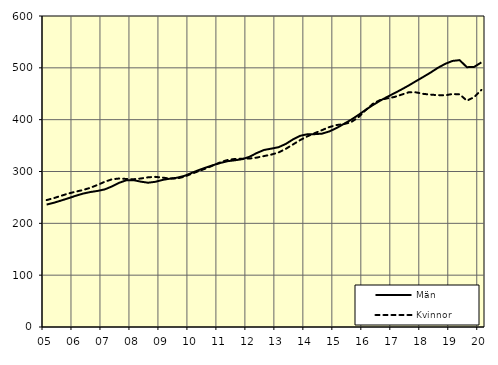
| Category | Män | Kvinnor |
|---|---|---|
| 5.0 | 236.18 | 244.84 |
| nan | 239.68 | 248.69 |
| 6.0 | 243.99 | 253.08 |
| 6.0 | 248.39 | 257.59 |
| 6.0 | 253.07 | 261.05 |
| nan | 257.26 | 264.18 |
| 7.0 | 260.29 | 268.44 |
| 7.0 | 262.45 | 273.95 |
| 7.0 | 265.41 | 280.09 |
| nan | 271.04 | 284.86 |
| 8.0 | 278.11 | 286.47 |
| 8.0 | 283.09 | 285.62 |
| 8.0 | 283.29 | 285.12 |
| nan | 280.43 | 286.44 |
| 9.0 | 278.35 | 288.83 |
| 9.0 | 280.11 | 289.65 |
| 9.0 | 283.76 | 288.23 |
| nan | 286.16 | 286.37 |
| 10.0 | 287.97 | 286.41 |
| 10.0 | 291.5 | 290.01 |
| 10.0 | 297.14 | 295.5 |
| nan | 302.76 | 300.79 |
| 11.0 | 307.73 | 306 |
| 11.0 | 312.32 | 311.85 |
| 11.0 | 316.56 | 317.87 |
| nan | 319.93 | 322.37 |
| 12.0 | 321.68 | 324.24 |
| 12.0 | 323.74 | 324.57 |
| 12.0 | 328.44 | 325 |
| nan | 335.63 | 326.82 |
| 13.0 | 341.53 | 329.76 |
| 13.0 | 344.1 | 332.6 |
| 13.0 | 346.85 | 336.72 |
| nan | 353.12 | 343.61 |
| 14.0 | 361.93 | 352.17 |
| 14.0 | 368.89 | 360.7 |
| 14.0 | 371.92 | 367.91 |
| nan | 372.05 | 374 |
| 15.0 | 373 | 379.81 |
| 15.0 | 377.21 | 385.6 |
| 15.0 | 383.76 | 389.62 |
| nan | 391.65 | 391.41 |
| 16.0 | 399.66 | 394.92 |
| 16.0 | 408.84 | 404.37 |
| 16.0 | 418.6 | 417.96 |
| nan | 427.88 | 430.31 |
| 17.0 | 436.37 | 437.78 |
| 17.0 | 443.95 | 441.07 |
| 17.0 | 451.06 | 443.77 |
| nan | 458.44 | 448.33 |
| 18.0 | 466.18 | 452.91 |
| 18.0 | 474.53 | 452.64 |
| 18.0 | 482.63 | 449.76 |
| nan | 490.99 | 448.31 |
| 19.0 | 500.07 | 447.28 |
| 19.0 | 507.61 | 447.07 |
| 19.0 | 513.29 | 449.48 |
| nan | 514.86 | 448.97 |
| 20.0 | 501.25 | 436.6 |
| 20.0 | 501.81 | 443.45 |
| 20.0 | 510.44 | 457.29 |